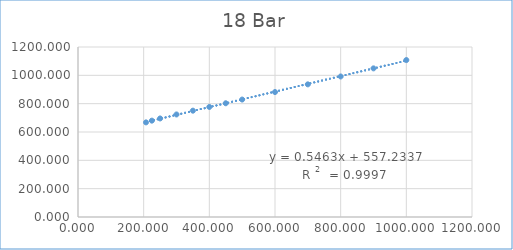
| Category | Series 0 |
|---|---|
| 207.1 | 667.917 |
| 225.0 | 680.172 |
| 250.0 | 695.581 |
| 300.0 | 723.817 |
| 350.0 | 750.549 |
| 400.0 | 776.78 |
| 450.0 | 802.891 |
| 500.0 | 829.049 |
| 600.0 | 882.059 |
| 700.0 | 936.312 |
| 800.0 | 991.973 |
| 900.0 | 1049.188 |
| 1000.0 | 1107.883 |